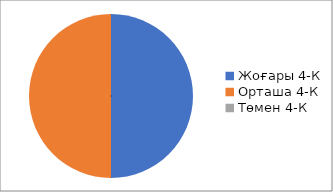
| Category | Series 0 |
|---|---|
| 0 | 4.167 |
| 1 | 4.167 |
| 2 | 0 |